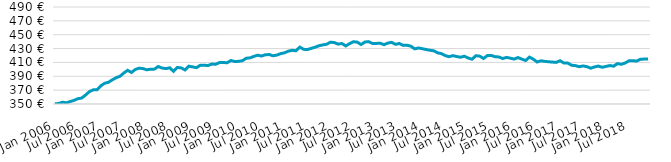
| Category | CNAM + SLM, CNDSSTI, CCMSA |
|---|---|
| 2006-01-31 | 350.16 |
| 2006-02-28 | 350.804 |
| 2006-03-31 | 352.585 |
| 2006-04-30 | 351.727 |
| 2006-05-31 | 353.575 |
| 2006-06-30 | 355.233 |
| 2006-07-31 | 357.683 |
| 2006-08-31 | 358.556 |
| 2006-09-30 | 362.886 |
| 2006-10-31 | 367.814 |
| 2006-11-30 | 370.459 |
| 2006-12-31 | 370.434 |
| 2007-01-31 | 376.29 |
| 2007-02-28 | 379.941 |
| 2007-03-31 | 381.382 |
| 2007-04-30 | 384.88 |
| 2007-05-31 | 387.979 |
| 2007-06-30 | 389.972 |
| 2007-07-31 | 394.74 |
| 2007-08-31 | 398.594 |
| 2007-09-30 | 395.506 |
| 2007-10-31 | 399.8 |
| 2007-11-30 | 401.683 |
| 2007-12-31 | 401.14 |
| 2008-01-31 | 399.387 |
| 2008-02-29 | 400.142 |
| 2008-03-31 | 400.354 |
| 2008-04-30 | 404.13 |
| 2008-05-31 | 401.875 |
| 2008-06-30 | 401.08 |
| 2008-07-31 | 402.259 |
| 2008-08-31 | 397.147 |
| 2008-09-30 | 402.758 |
| 2008-10-31 | 402.072 |
| 2008-11-30 | 399.181 |
| 2008-12-31 | 404.576 |
| 2009-01-31 | 403.55 |
| 2009-02-28 | 402.455 |
| 2009-03-31 | 405.991 |
| 2009-04-30 | 406.002 |
| 2009-05-31 | 405.539 |
| 2009-06-30 | 407.661 |
| 2009-07-31 | 407.381 |
| 2009-08-31 | 409.746 |
| 2009-09-30 | 409.905 |
| 2009-10-31 | 409.531 |
| 2009-11-30 | 412.789 |
| 2009-12-31 | 411.274 |
| 2010-01-31 | 411.59 |
| 2010-02-28 | 412.499 |
| 2010-03-31 | 416.038 |
| 2010-04-30 | 416.614 |
| 2010-05-31 | 418.742 |
| 2010-06-30 | 420.447 |
| 2010-07-31 | 419.199 |
| 2010-08-31 | 421.078 |
| 2010-09-30 | 421.374 |
| 2010-10-31 | 419.623 |
| 2010-11-30 | 420.617 |
| 2010-12-31 | 422.677 |
| 2011-01-31 | 423.86 |
| 2011-02-28 | 426.272 |
| 2011-03-31 | 427.487 |
| 2011-04-30 | 426.776 |
| 2011-05-31 | 432.16 |
| 2011-06-30 | 428.894 |
| 2011-07-31 | 428.617 |
| 2011-08-31 | 430.332 |
| 2011-09-30 | 431.96 |
| 2011-10-31 | 434.091 |
| 2011-11-30 | 435.305 |
| 2011-12-31 | 436.23 |
| 2012-01-31 | 439.226 |
| 2012-02-29 | 438.684 |
| 2012-03-31 | 436.381 |
| 2012-04-30 | 437.345 |
| 2012-05-31 | 433.784 |
| 2012-06-30 | 437.176 |
| 2012-07-31 | 439.873 |
| 2012-08-31 | 439.322 |
| 2012-09-30 | 435.834 |
| 2012-10-31 | 439.471 |
| 2012-11-30 | 440 |
| 2012-12-31 | 437.32 |
| 2013-01-31 | 437.443 |
| 2013-02-28 | 437.71 |
| 2013-03-31 | 435.593 |
| 2013-04-30 | 437.958 |
| 2013-05-31 | 438.956 |
| 2013-06-30 | 436.071 |
| 2013-07-31 | 437.315 |
| 2013-08-31 | 434.607 |
| 2013-09-30 | 434.859 |
| 2013-10-31 | 433.479 |
| 2013-11-30 | 429.626 |
| 2013-12-31 | 430.806 |
| 2014-01-31 | 429.824 |
| 2014-02-28 | 428.631 |
| 2014-03-31 | 427.567 |
| 2014-04-30 | 426.781 |
| 2014-05-31 | 423.825 |
| 2014-06-30 | 422.72 |
| 2014-07-31 | 419.835 |
| 2014-08-31 | 418.275 |
| 2014-09-30 | 419.783 |
| 2014-10-31 | 418.529 |
| 2014-11-30 | 417.503 |
| 2014-12-31 | 418.983 |
| 2015-01-31 | 416.281 |
| 2015-02-28 | 414.678 |
| 2015-03-31 | 419.653 |
| 2015-04-30 | 419.137 |
| 2015-05-31 | 415.654 |
| 2015-06-30 | 419.871 |
| 2015-07-31 | 420.033 |
| 2015-08-31 | 418.261 |
| 2015-09-30 | 417.924 |
| 2015-10-31 | 415.585 |
| 2015-11-30 | 417.296 |
| 2015-12-31 | 416.132 |
| 2016-01-31 | 414.859 |
| 2016-02-29 | 417.068 |
| 2016-03-31 | 414.762 |
| 2016-04-30 | 412.791 |
| 2016-05-31 | 417.675 |
| 2016-06-30 | 414.691 |
| 2016-07-31 | 410.595 |
| 2016-08-31 | 412.32 |
| 2016-09-30 | 411.518 |
| 2016-10-31 | 410.968 |
| 2016-11-30 | 410.516 |
| 2016-12-31 | 410.057 |
| 2017-01-31 | 412.487 |
| 2017-02-28 | 409.091 |
| 2017-03-31 | 409.161 |
| 2017-04-30 | 405.948 |
| 2017-05-31 | 405.398 |
| 2017-06-30 | 403.846 |
| 2017-07-31 | 404.905 |
| 2017-08-31 | 403.959 |
| 2017-09-30 | 401.678 |
| 2017-10-31 | 403.511 |
| 2017-11-30 | 404.715 |
| 2017-12-31 | 403.033 |
| 2018-01-31 | 404.232 |
| 2018-02-28 | 405.462 |
| 2018-03-31 | 404.62 |
| 2018-04-30 | 408.321 |
| 2018-05-31 | 407.278 |
| 2018-06-30 | 409.144 |
| 2018-07-31 | 412.293 |
| 2018-08-31 | 412.527 |
| 2018-09-30 | 411.951 |
| 2018-10-31 | 414.627 |
| 2018-11-30 | 414.837 |
| 2018-12-31 | 415.058 |